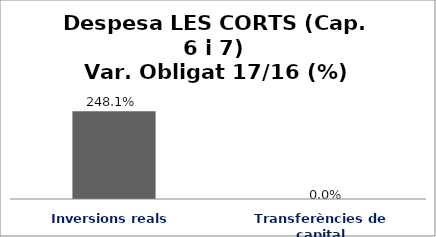
| Category | Series 0 |
|---|---|
| Inversions reals | 2.481 |
| Transferències de capital | 0 |